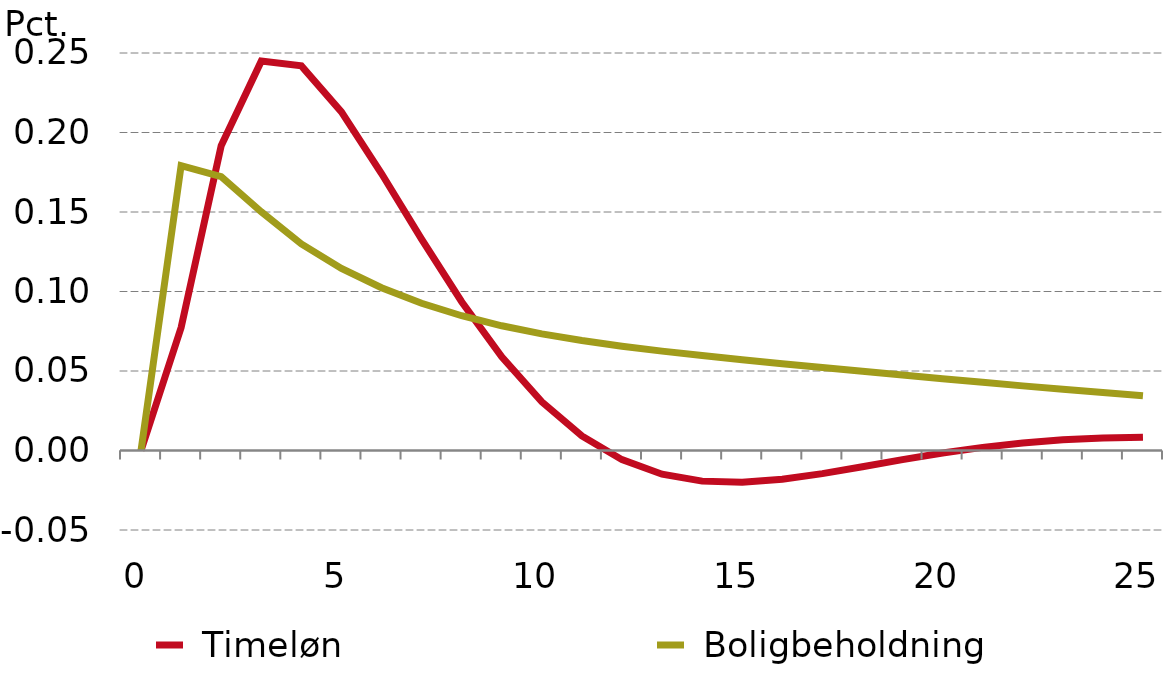
| Category |  Timeløn |  Boligbeholdning |
|---|---|---|
| 0.0 | 0 | 0 |
| nan | 0.077 | 0.179 |
| nan | 0.192 | 0.172 |
| nan | 0.245 | 0.15 |
| nan | 0.242 | 0.13 |
| 5.0 | 0.213 | 0.114 |
| nan | 0.174 | 0.102 |
| nan | 0.133 | 0.093 |
| nan | 0.094 | 0.085 |
| nan | 0.059 | 0.078 |
| 10.0 | 0.031 | 0.073 |
| nan | 0.009 | 0.069 |
| nan | -0.006 | 0.066 |
| nan | -0.015 | 0.063 |
| nan | -0.019 | 0.06 |
| 15.0 | -0.02 | 0.057 |
| nan | -0.018 | 0.055 |
| nan | -0.015 | 0.052 |
| nan | -0.01 | 0.05 |
| nan | -0.006 | 0.047 |
| 20.0 | -0.002 | 0.045 |
| nan | 0.002 | 0.043 |
| nan | 0.005 | 0.041 |
| nan | 0.007 | 0.038 |
| nan | 0.008 | 0.036 |
| 25.0 | 0.008 | 0.034 |